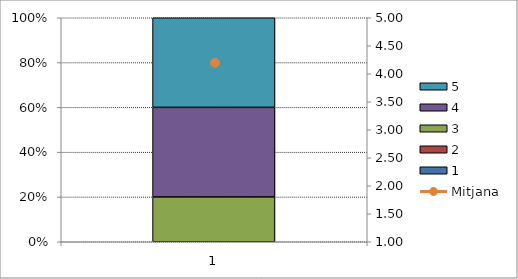
| Category | 1 | 2 | 3 | 4 | 5 |
|---|---|---|---|---|---|
| 0 | 0 | 0 | 1 | 2 | 2 |